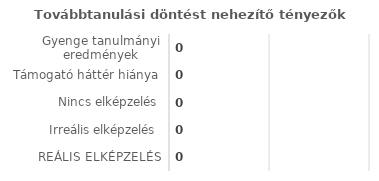
| Category | Series 0 |
|---|---|
| REÁLIS ELKÉPZELÉS | 0 |
| Irreális elképzelés | 0 |
| Nincs elképzelés | 0 |
| Támogató háttér hiánya | 0 |
| Gyenge tanulmányi eredmények | 0 |